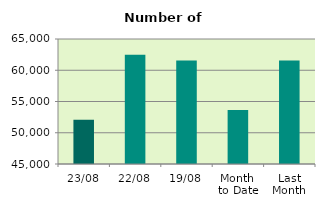
| Category | Series 0 |
|---|---|
| 23/08 | 52080 |
| 22/08 | 62476 |
| 19/08 | 61576 |
| Month 
to Date | 53635.765 |
| Last
Month | 61549.619 |